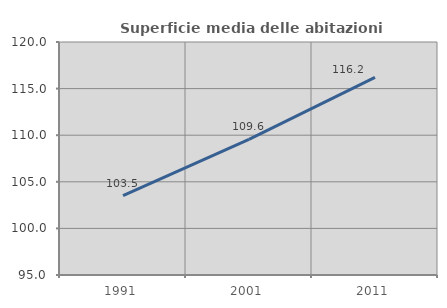
| Category | Superficie media delle abitazioni occupate |
|---|---|
| 1991.0 | 103.505 |
| 2001.0 | 109.558 |
| 2011.0 | 116.196 |